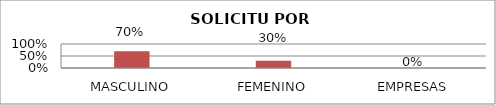
| Category | Series 1 |
|---|---|
| MASCULINO | 0.696 |
| FEMENINO | 0.304 |
| EMPRESAS | 0 |